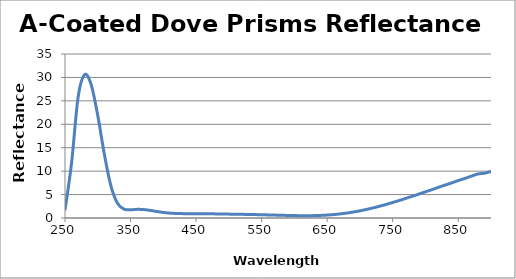
| Category | Reflectance (%) |
|---|---|
| 250.0 | 1.678 |
| 260.0 | 11.728 |
| 270.0 | 25.794 |
| 280.0 | 30.596 |
| 290.0 | 28.419 |
| 300.0 | 21.856 |
| 310.0 | 13.639 |
| 320.0 | 6.88 |
| 330.0 | 3.167 |
| 340.0 | 1.894 |
| 350.0 | 1.754 |
| 360.0 | 1.844 |
| 370.0 | 1.805 |
| 380.0 | 1.627 |
| 390.0 | 1.391 |
| 400.0 | 1.186 |
| 410.0 | 1.043 |
| 420.0 | 0.967 |
| 430.0 | 0.931 |
| 440.0 | 0.92 |
| 450.0 | 0.914 |
| 460.0 | 0.906 |
| 470.0 | 0.896 |
| 480.0 | 0.876 |
| 490.0 | 0.852 |
| 500.0 | 0.827 |
| 510.0 | 0.803 |
| 520.0 | 0.781 |
| 530.0 | 0.757 |
| 540.0 | 0.729 |
| 550.0 | 0.697 |
| 560.0 | 0.66 |
| 570.0 | 0.621 |
| 580.0 | 0.581 |
| 590.0 | 0.546 |
| 600.0 | 0.515 |
| 610.0 | 0.496 |
| 620.0 | 0.493 |
| 630.0 | 0.51 |
| 640.0 | 0.553 |
| 650.0 | 0.626 |
| 660.0 | 0.734 |
| 670.0 | 0.878 |
| 680.0 | 1.055 |
| 690.0 | 1.276 |
| 700.0 | 1.531 |
| 710.0 | 1.825 |
| 720.0 | 2.152 |
| 730.0 | 2.511 |
| 740.0 | 2.896 |
| 750.0 | 3.309 |
| 760.0 | 3.737 |
| 770.0 | 4.191 |
| 780.0 | 4.646 |
| 790.0 | 5.115 |
| 800.0 | 5.591 |
| 810.0 | 6.057 |
| 820.0 | 6.554 |
| 830.0 | 7.02 |
| 840.0 | 7.493 |
| 850.0 | 7.988 |
| 860.0 | 8.442 |
| 870.0 | 8.926 |
| 880.0 | 9.401 |
| 890.0 | 9.551 |
| 900.0 | 9.946 |